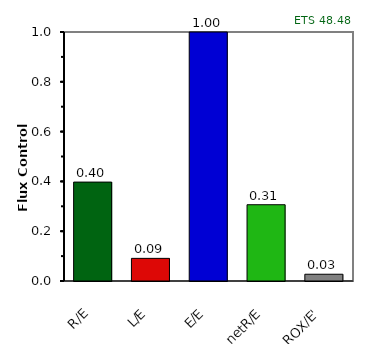
| Category | ETS 48,48 |
|---|---|
| R/E | 0.397 |
| L/E | 0.091 |
| E/E | 1 |
| netR/E | 0.306 |
| ROX/E' | 0.027 |